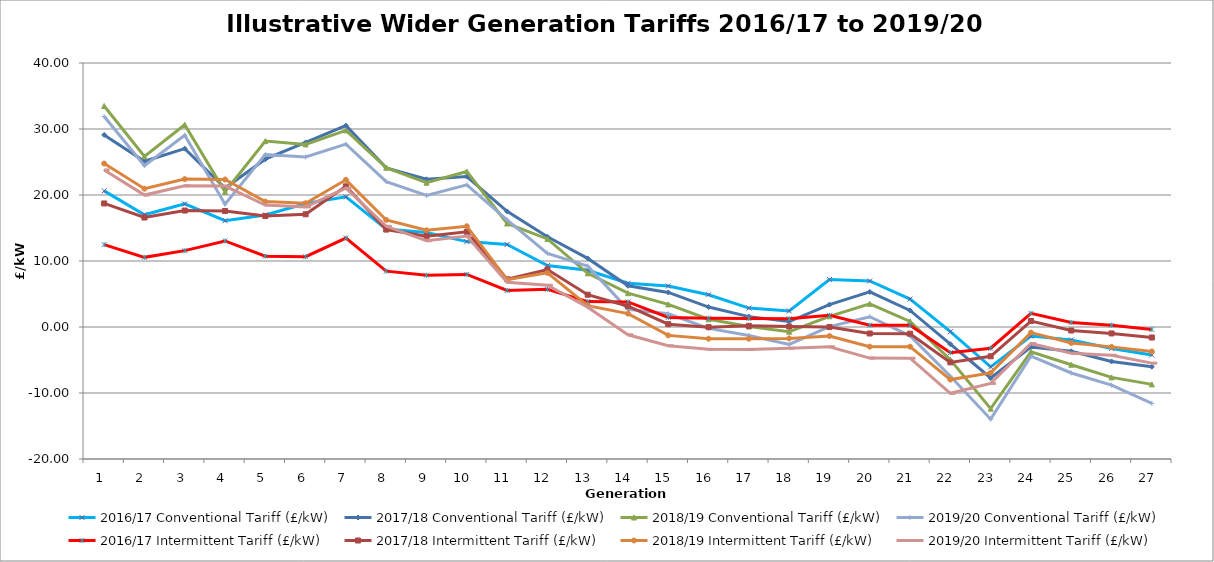
| Category | 2016/17 Conventional Tariff (£/kW) | 2017/18 Conventional Tariff (£/kW) | 2018/19 Conventional Tariff (£/kW) | 2019/20 Conventional Tariff (£/kW) | 2016/17 Intermittent Tariff (£/kW) | 2017/18 Intermittent Tariff (£/kW) | 2018/19 Intermittent Tariff (£/kW) | 2019/20 Intermittent Tariff (£/kW) |
|---|---|---|---|---|---|---|---|---|
| 1.0 | 20.63 | 29.107 | 33.488 | 31.894 | 12.481 | 18.719 | 24.767 | 23.791 |
| 2.0 | 16.999 | 25.116 | 25.853 | 24.448 | 10.554 | 16.585 | 20.954 | 19.993 |
| 3.0 | 18.654 | 27.026 | 30.64 | 29.055 | 11.57 | 17.644 | 22.407 | 21.403 |
| 4.0 | 16.097 | 21.058 | 20.487 | 18.609 | 13.039 | 17.575 | 22.349 | 21.356 |
| 5.0 | 16.977 | 25.426 | 28.164 | 26.132 | 10.734 | 16.813 | 18.999 | 18.474 |
| 6.0 | 18.71 | 27.957 | 27.667 | 25.764 | 10.651 | 17.078 | 18.752 | 18.189 |
| 7.0 | 19.723 | 30.51 | 29.792 | 27.709 | 13.47 | 21.313 | 22.299 | 21.036 |
| 8.0 | 14.833 | 24.113 | 24.136 | 22.033 | 8.465 | 14.761 | 16.221 | 15.258 |
| 9.0 | 14.308 | 22.384 | 21.86 | 19.945 | 7.848 | 13.755 | 14.651 | 13.074 |
| 10.0 | 12.937 | 22.795 | 23.561 | 21.544 | 7.963 | 14.426 | 15.27 | 13.785 |
| 11.0 | 12.501 | 17.521 | 15.685 | 16.231 | 5.537 | 7.239 | 7.174 | 6.778 |
| 12.0 | 9.304 | 13.673 | 13.343 | 11.165 | 5.709 | 8.712 | 8.2 | 6.325 |
| 13.0 | 8.594 | 10.394 | 8.133 | 9.226 | 3.854 | 4.89 | 3.236 | 2.989 |
| 14.0 | 6.624 | 6.249 | 5.121 | 2.694 | 3.803 | 3.148 | 2.031 | -1.183 |
| 15.0 | 6.212 | 5.241 | 3.421 | 2.012 | 1.456 | 0.427 | -1.271 | -2.845 |
| 16.0 | 4.892 | 3.024 | 1.169 | -0.206 | 1.326 | -0.02 | -1.777 | -3.381 |
| 17.0 | 2.864 | 1.572 | 0.065 | -1.275 | 1.287 | 0.173 | -1.776 | -3.397 |
| 18.0 | 2.436 | 0.828 | -0.716 | -2.646 | 1.268 | 0.072 | -1.73 | -3.21 |
| 19.0 | 7.196 | 3.399 | 1.622 | 0.051 | 1.782 | -0.002 | -1.372 | -2.996 |
| 20.0 | 6.974 | 5.314 | 3.507 | 1.558 | 0.278 | -0.987 | -2.976 | -4.713 |
| 21.0 | 4.233 | 2.511 | 0.849 | -1.34 | 0.249 | -1.013 | -2.981 | -4.733 |
| 22.0 | -0.708 | -2.6 | -4.961 | -7.458 | -3.883 | -5.357 | -7.968 | -10.045 |
| 23.0 | -6.043 | -7.731 | -12.369 | -13.967 | -3.221 | -4.437 | -6.949 | -8.549 |
| 24.0 | -1.383 | -3.023 | -3.755 | -4.406 | 2.067 | 0.902 | -0.851 | -2.494 |
| 25.0 | -1.949 | -3.684 | -5.722 | -6.967 | 0.683 | -0.531 | -2.42 | -3.978 |
| 26.0 | -3.252 | -5.221 | -7.634 | -8.807 | 0.268 | -0.976 | -3.011 | -4.285 |
| 27.0 | -4.24 | -6.024 | -8.695 | -11.578 | -0.374 | -1.593 | -3.708 | -5.478 |